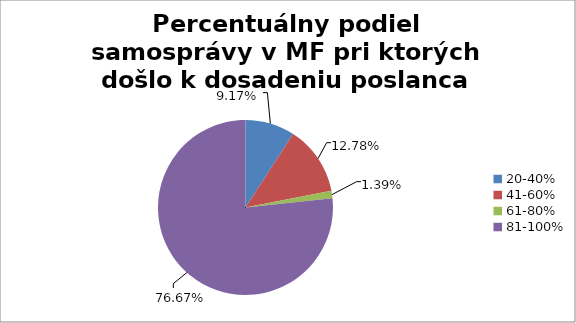
| Category | Percentuálny podiel samosprávy v MF pri ktorých došlo k dosadeniu poslanca |
|---|---|
| 20-40% | 0.092 |
| 41-60% | 0.128 |
| 61-80% | 0.014 |
| 81-100% | 0.767 |